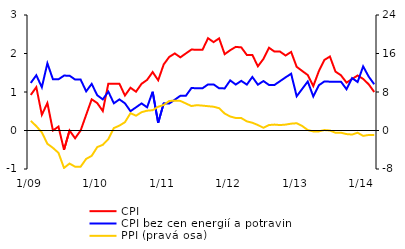
| Category | CPI | CPI bez cen energií a potravin |
|---|---|---|
| 1/09 | 0.924 | 1.236 |
| 2 | 1.125 | 1.434 |
| 3 | 0.407 | 1.124 |
| 4 | 0.714 | 1.745 |
| 5 | 0 | 1.331 |
| 6 | 0.101 | 1.329 |
| 7 | -0.503 | 1.426 |
| 8 | 0 | 1.424 |
| 9 | -0.202 | 1.324 |
| 10 | 0 | 1.322 |
| 11 | 0.407 | 1.017 |
| 12 | 0.81 | 1.21 |
| 1/10 | 0.712 | 0.916 |
| 2 | 0.506 | 0.808 |
| 3 | 1.216 | 1.01 |
| 4 | 1.215 | 0.706 |
| 5 | 1.216 | 0.808 |
| 6 | 0.909 | 0.706 |
| 7 | 1.111 | 0.502 |
| 8 | 1.008 | 0.602 |
| 9 | 1.213 | 0.704 |
| 10 | 1.314 | 0.602 |
| 11 | 1.518 | 1.007 |
| 12 | 1.305 | 0.199 |
| 1/11 | 1.717 | 0.706 |
| 2 | 1.911 | 0.701 |
| 3 | 2.002 | 0.8 |
| 4 | 1.9 | 0.902 |
| 5 | 2.002 | 0.902 |
| 6 | 2.102 | 1.102 |
| 7 | 2.098 | 1.099 |
| 8 | 2.096 | 1.097 |
| 9 | 2.398 | 1.198 |
| 10 | 2.295 | 1.198 |
| 11 | 2.393 | 1.097 |
| 12 | 1.982 | 1.093 |
| 1/12 | 2.085 | 1.301 |
| 2 | 2.172 | 1.194 |
| 3 | 2.159 | 1.29 |
| 4 | 1.963 | 1.192 |
| 5 | 1.963 | 1.39 |
| 6 | 1.667 | 1.189 |
| 7 | 1.859 | 1.285 |
| 8 | 2.151 | 1.183 |
| 9 | 2.049 | 1.183 |
| 10 | 2.049 | 1.282 |
| 11 | 1.947 | 1.381 |
| 12 | 2.041 | 1.475 |
| 1/13 | 1.654 | 0.889 |
| 2 | 1.546 | 1.082 |
| 3 | 1.441 | 1.273 |
| 4 | 1.155 | 0.883 |
| 5 | 1.54 | 1.175 |
| 6 | 1.832 | 1.273 |
| 7 | 1.921 | 1.268 |
| 8 | 1.531 | 1.267 |
| 9 | 1.434 | 1.267 |
| 10 | 1.243 | 1.071 |
| 11 | 1.337 | 1.362 |
| 12 | 1.429 | 1.26 |
| 1/14 | 1.34 | 1.665 |
| 2 | 1.2 | 1.4 |
| 3 | 1 | 1.2 |